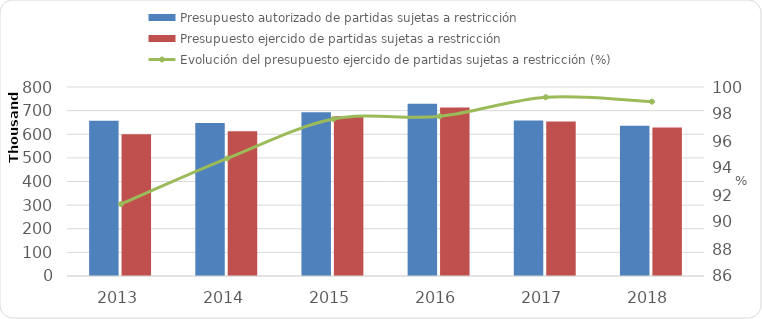
| Category | Presupuesto autorizado de partidas sujetas a restricción | Presupuesto ejercido de partidas sujetas a restricción  |
|---|---|---|
| 2013 | 657148.1 | 600163.1 |
| 2014 | 647302.9 | 613052.1 |
| 2015 | 692840.462 | 676403.338 |
| 2016 | 729594.261 | 713725.8 |
| 2017 | 658646.191 | 653670.792 |
| 2018 | 635684.884 | 628799.563 |